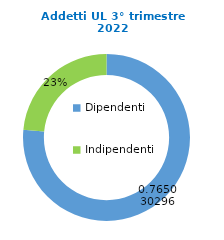
| Category | Series 0 |
|---|---|
| Dipendenti | 63255 |
| Indipendenti | 19428 |